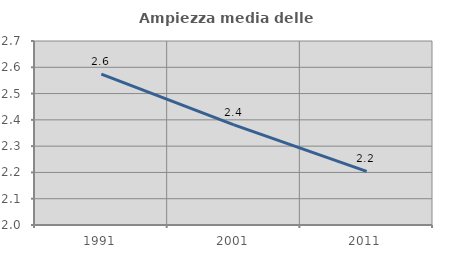
| Category | Ampiezza media delle famiglie |
|---|---|
| 1991.0 | 2.574 |
| 2001.0 | 2.381 |
| 2011.0 | 2.204 |